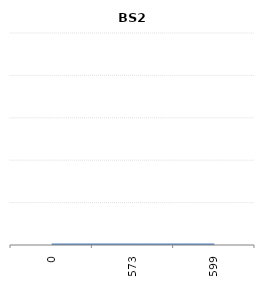
| Category | BS2 |
|---|---|
| 0.0 | 0 |
| 573.0 | 0 |
| 599.0 | 0 |